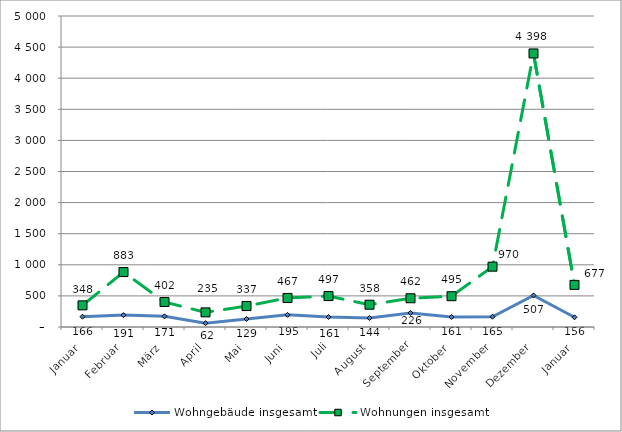
| Category | Wohngebäude insgesamt | Wohnungen insgesamt |
|---|---|---|
| Januar | 166 | 348 |
| Februar | 191 | 883 |
| März | 171 | 402 |
| April | 62 | 235 |
| Mai | 129 | 337 |
| Juni | 195 | 467 |
| Juli | 161 | 497 |
| August | 144 | 358 |
| September | 226 | 462 |
| Oktober | 161 | 495 |
| November | 165 | 970 |
| Dezember | 507 | 4398 |
| Januar | 156 | 677 |